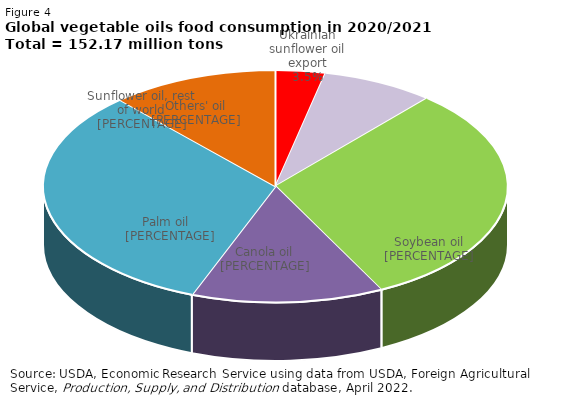
| Category | Series 0 |
|---|---|
| Ukrainian sunflower oil export | 5.273 |
| Sunflower oil, rest of world | 11.951 |
| Soybean oil  | 47.417 |
| Canola oil  | 20.349 |
| Palm oil  | 49.423 |
| Others' oil | 17.757 |